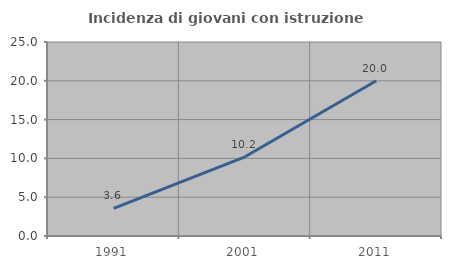
| Category | Incidenza di giovani con istruzione universitaria |
|---|---|
| 1991.0 | 3.571 |
| 2001.0 | 10.204 |
| 2011.0 | 20 |